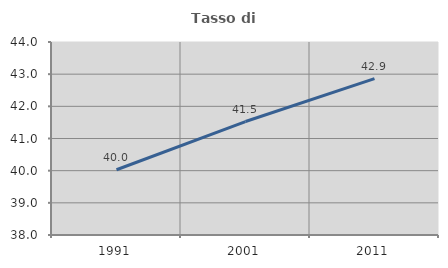
| Category | Tasso di occupazione   |
|---|---|
| 1991.0 | 40.029 |
| 2001.0 | 41.527 |
| 2011.0 | 42.861 |